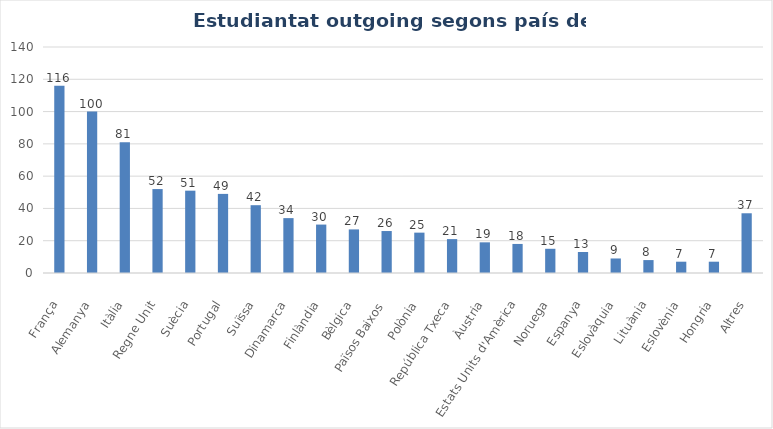
| Category | Series 0 |
|---|---|
| França | 116 |
| Alemanya | 100 |
| Itàlia | 81 |
| Regne Unit | 52 |
| Suècia | 51 |
| Portugal | 49 |
| Suïssa | 42 |
| Dinamarca | 34 |
| Finlàndia | 30 |
| Bèlgica | 27 |
| Països Baixos | 26 |
| Polònia | 25 |
| República Txeca | 21 |
| Àustria | 19 |
| Estats Units d'Amèrica | 18 |
| Noruega | 15 |
| Espanya | 13 |
| Eslovàquia | 9 |
| Lituània | 8 |
| Eslovènia | 7 |
| Hongria | 7 |
| Altres | 37 |